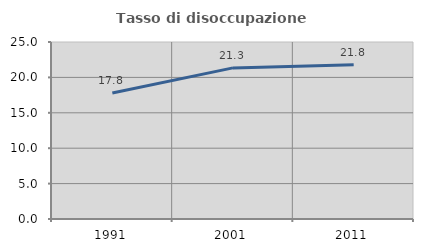
| Category | Tasso di disoccupazione giovanile  |
|---|---|
| 1991.0 | 17.808 |
| 2001.0 | 21.341 |
| 2011.0 | 21.782 |